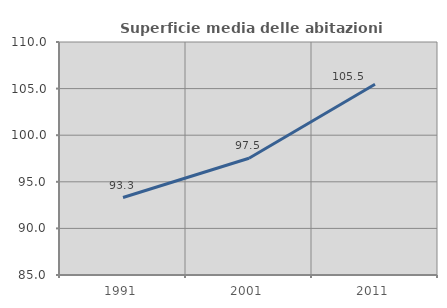
| Category | Superficie media delle abitazioni occupate |
|---|---|
| 1991.0 | 93.314 |
| 2001.0 | 97.524 |
| 2011.0 | 105.465 |